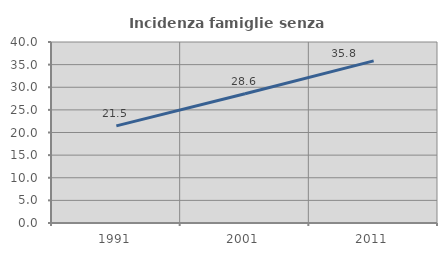
| Category | Incidenza famiglie senza nuclei |
|---|---|
| 1991.0 | 21.472 |
| 2001.0 | 28.558 |
| 2011.0 | 35.831 |